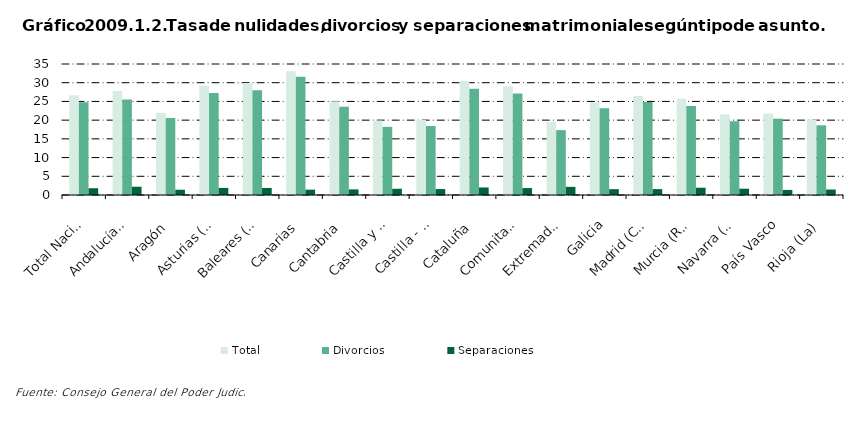
| Category | Total | Divorcios | Separaciones |
|---|---|---|---|
| Total Nacional | 26.653 | 24.805 | 1.811 |
| Andalucía(1) | 27.788 | 25.528 | 2.209 |
| Aragón | 21.97 | 20.558 | 1.405 |
| Asturias (Principado de) | 29.181 | 27.228 | 1.889 |
| Baleares (Illes) | 29.934 | 27.971 | 1.881 |
| Canarias | 33.037 | 31.588 | 1.426 |
| Cantabria | 25.066 | 23.556 | 1.493 |
| Castilla y León | 19.891 | 18.202 | 1.662 |
| Castilla - La Mancha | 20.045 | 18.426 | 1.586 |
| Cataluña | 30.438 | 28.401 | 2.009 |
| Comunitat Valenciana | 29.038 | 27.134 | 1.851 |
| Extremadura | 19.566 | 17.335 | 2.177 |
| Galicia | 24.777 | 23.207 | 1.559 |
| Madrid (Comunidad de) | 26.468 | 24.868 | 1.57 |
| Murcia (Región de) | 25.738 | 23.774 | 1.943 |
| Navarra (Comunidad Foral de) | 21.536 | 19.712 | 1.681 |
| País Vasco | 21.762 | 20.385 | 1.353 |
| Rioja (La) | 20.143 | 18.62 | 1.461 |